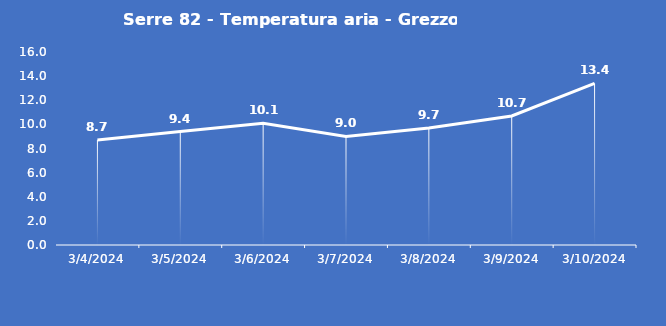
| Category | Serre 82 - Temperatura aria - Grezzo (°C) |
|---|---|
| 3/4/24 | 8.7 |
| 3/5/24 | 9.4 |
| 3/6/24 | 10.1 |
| 3/7/24 | 9 |
| 3/8/24 | 9.7 |
| 3/9/24 | 10.7 |
| 3/10/24 | 13.4 |